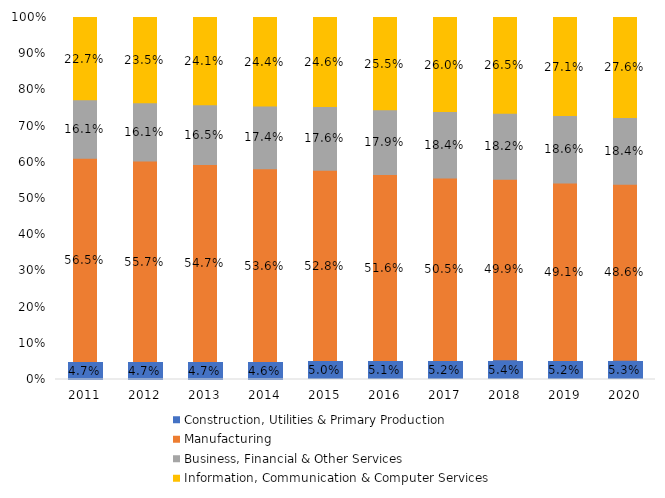
| Category | Construction, Utilities & Primary Production  | Manufacturing  | Business, Financial & Other Services | Information, Communication & Computer Services |
|---|---|---|---|---|
| 2011.0 | 0.047 | 0.565 | 0.161 | 0.227 |
| 2012.0 | 0.047 | 0.557 | 0.161 | 0.235 |
| 2013.0 | 0.047 | 0.547 | 0.165 | 0.241 |
| 2014.0 | 0.046 | 0.536 | 0.174 | 0.244 |
| 2015.0 | 0.05 | 0.528 | 0.176 | 0.246 |
| 2016.0 | 0.051 | 0.516 | 0.179 | 0.255 |
| 2017.0 | 0.052 | 0.505 | 0.184 | 0.26 |
| 2018.0 | 0.054 | 0.499 | 0.182 | 0.265 |
| 2019.0 | 0.052 | 0.491 | 0.186 | 0.271 |
| 2020.0 | 0.053 | 0.486 | 0.184 | 0.276 |